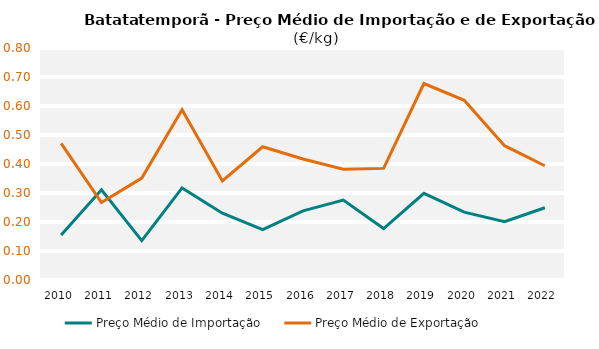
| Category | Preço Médio de Importação | Preço Médio de Exportação |
|---|---|---|
| 2010.0 | 0.156 | 0.471 |
| 2011.0 | 0.311 | 0.267 |
| 2012.0 | 0.136 | 0.351 |
| 2013.0 | 0.318 | 0.587 |
| 2014.0 | 0.23 | 0.341 |
| 2015.0 | 0.174 | 0.459 |
| 2016.0 | 0.238 | 0.417 |
| 2017.0 | 0.275 | 0.382 |
| 2018.0 | 0.178 | 0.385 |
| 2019.0 | 0.299 | 0.678 |
| 2020.0 | 0.234 | 0.619 |
| 2021.0 | 0.201 | 0.463 |
| 2022.0 | 0.249 | 0.394 |